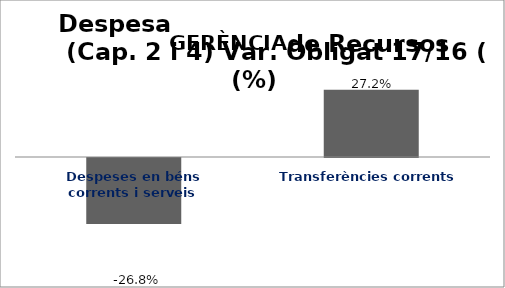
| Category | Series 0 |
|---|---|
| Despeses en béns corrents i serveis | -0.268 |
| Transferències corrents | 0.272 |